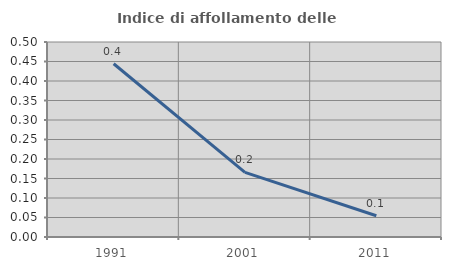
| Category | Indice di affollamento delle abitazioni  |
|---|---|
| 1991.0 | 0.444 |
| 2001.0 | 0.166 |
| 2011.0 | 0.055 |